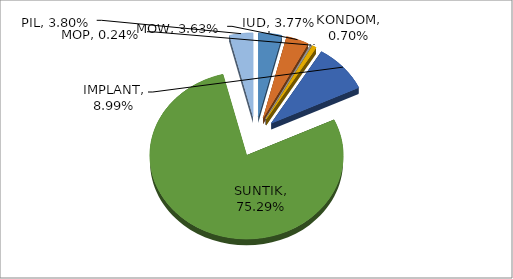
| Category | Series 0 |
|---|---|
| IUD | 0.038 |
| MOW | 0.036 |
| MOP | 0.002 |
| KONDOM | 0.007 |
| IMPLANT | 0.09 |
| SUNTIK | 0.753 |
| PIL | 0.038 |